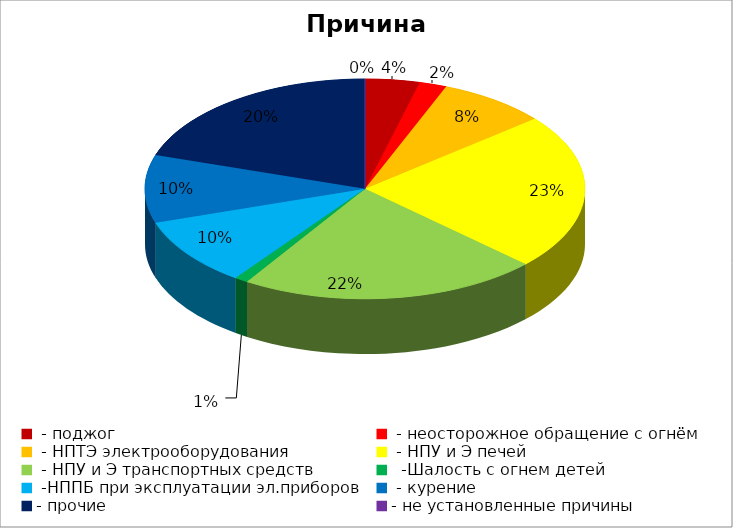
| Category | Причина пожара |
|---|---|
|  - поджог | 4 |
|  - неосторожное обращение с огнём | 2 |
|  - НПТЭ электрооборудования | 8 |
|  - НПУ и Э печей | 23 |
|  - НПУ и Э транспортных средств | 22 |
|   -Шалость с огнем детей | 1 |
|  -НППБ при эксплуатации эл.приборов | 10 |
|  - курение | 10 |
| - прочие | 20 |
| - не установленные причины | 0 |